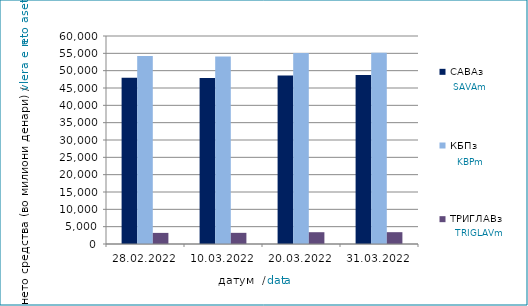
| Category | САВАз | КБПз | ТРИГЛАВз |
|---|---|---|---|
| 2022-02-28 | 47974.971 | 54200.12 | 3203.538 |
| 2022-03-10 | 47882.052 | 54121.068 | 3220.427 |
| 2022-03-20 | 48619.925 | 55069.979 | 3400.77 |
| 2022-03-31 | 48743.084 | 55145.242 | 3410.422 |